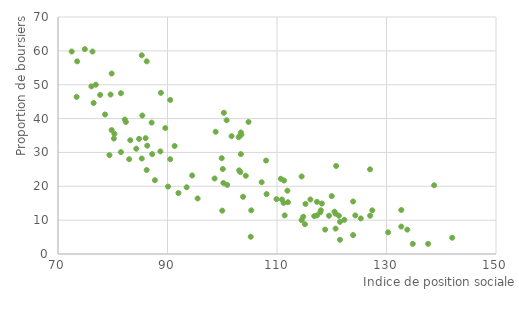
| Category | Bours. GT Ech. |
|---|---|
| 119.5 | 11.3 |
| 101.7 | 34.8 |
| 103.8 | 16.9 |
| 117.3 | 15.4 |
| 125.3 | 10.5 |
| 115.2 | 14.8 |
| 117.9 | 12.3 |
| 121.5 | 4.2 |
| 114.5 | 22.9 |
| 123.9 | 15.5 |
| 121.3 | 11.3 |
| 118.0 | 12.9 |
| 132.7 | 8.1 |
| 107.2 | 21.2 |
| 111.9 | 18.7 |
| 120.7 | 11.9 |
| 122.3 | 10.1 |
| 112.0 | 15.3 |
| 100.3 | 41.7 |
| 132.7 | 13 |
| 120.8 | 26 |
| 127.0 | 25 |
| 100.8 | 39.5 |
| 104.8 | 39 |
| 103.3 | 35 |
| 108.0 | 27.6 |
| 86.2 | 56.9 |
| 142.0 | 4.8 |
| 133.8 | 7.2 |
| 130.3 | 6.4 |
| 124.3 | 11.4 |
| 138.7 | 20.3 |
| 116.8 | 11.2 |
| 120.0 | 17.1 |
| 103.5 | 35.3 |
| 123.9 | 5.6 |
| 114.5 | 10 |
| 115.1 | 8.8 |
| 105.2 | 5.1 |
| 127.4 | 12.9 |
| 110.7 | 22.2 |
| 108.1 | 17.7 |
| 118.8 | 7.2 |
| 94.5 | 23.2 |
| 117.3 | 11.4 |
| 120.5 | 12.5 |
| 114.8 | 11 |
| 105.3 | 12.9 |
| 134.8 | 3 |
| 103.4 | 35.9 |
| 103.0 | 34.5 |
| 98.8 | 36.1 |
| 127.0 | 11.3 |
| 103.4 | 29.5 |
| 90.5 | 45.5 |
| 111.3 | 21.7 |
| 118.2 | 14.9 |
| 121.5 | 9.5 |
| 111.2 | 15.1 |
| 109.9 | 16.2 |
| 116.1 | 16.1 |
| 103.3 | 24.2 |
| 99.9 | 28.3 |
| 137.6 | 3 |
| 110.9 | 16.1 |
| 120.7 | 7.5 |
| 79.4 | 29.2 |
| 87.7 | 21.8 |
| 86.3 | 32 |
| 84.8 | 34 |
| 111.4 | 11.4 |
| 100.1 | 25.1 |
| 73.4 | 46.4 |
| 103.1 | 24.7 |
| 87.2 | 29.5 |
| 90.1 | 19.9 |
| 98.6 | 22.3 |
| 83.2 | 33.6 |
| 85.3 | 28.2 |
| 100.2 | 21 |
| 74.9 | 60.5 |
| 78.6 | 41.2 |
| 100.9 | 20.4 |
| 80.3 | 35.5 |
| 84.3 | 31.1 |
| 90.5 | 28 |
| 85.4 | 40.9 |
| 79.6 | 47.1 |
| 76.3 | 59.8 |
| 81.5 | 47.5 |
| 76.9 | 50 |
| 104.3 | 23.1 |
| 79.8 | 53.3 |
| 92.0 | 18 |
| 86.2 | 24.8 |
| 100.0 | 12.8 |
| 86.0 | 34.2 |
| 82.2 | 39.7 |
| 95.5 | 16.4 |
| 79.8 | 36.6 |
| 93.5 | 19.7 |
| 88.7 | 30.3 |
| 76.5 | 44.6 |
| 80.2 | 34.1 |
| 81.5 | 30.1 |
| 72.5 | 59.8 |
| 73.5 | 56.9 |
| 77.7 | 47 |
| 88.8 | 47.6 |
| 85.3 | 58.7 |
| 91.3 | 31.9 |
| 83.0 | 28 |
| 89.6 | 37.2 |
| 82.4 | 39 |
| 76.1 | 49.5 |
| 87.1 | 38.8 |